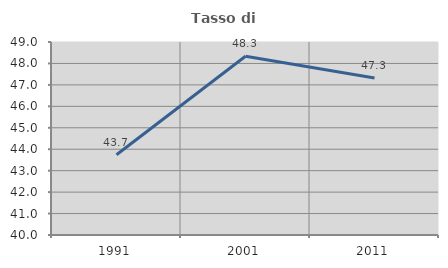
| Category | Tasso di occupazione   |
|---|---|
| 1991.0 | 43.742 |
| 2001.0 | 48.334 |
| 2011.0 | 47.319 |